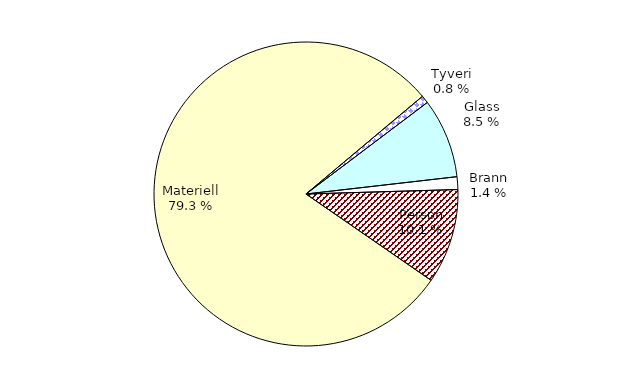
| Category | Series 0 |
|---|---|
| Tyveri | 39.838 |
| Glass | 409.607 |
| Brann | 65.318 |
| Person | 487.675 |
| Materiell | 3834.304 |